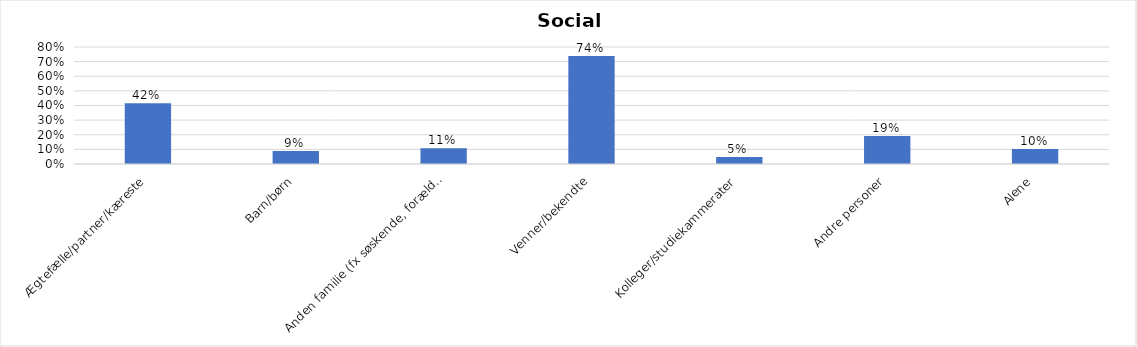
| Category | % |
|---|---|
| Ægtefælle/partner/kæreste | 0.416 |
| Barn/børn | 0.088 |
| Anden familie (fx søskende, forældre) | 0.108 |
| Venner/bekendte | 0.738 |
| Kolleger/studiekammerater | 0.048 |
| Andre personer | 0.192 |
| Alene | 0.103 |